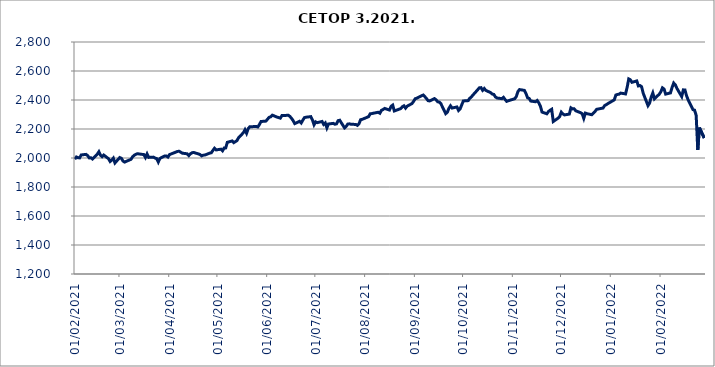
| Category | CETOP |
|---|---|
| 01/02/2021 | 1991.99 |
| 02/02/2021 | 2007.22 |
| 03/02/2021 | 2001.98 |
| 04/02/2021 | 2000.87 |
| 05/02/2021 | 2021.06 |
| 08/02/2021 | 2024.95 |
| 09/02/2021 | 2016.39 |
| 10/02/2021 | 2000.46 |
| 11/02/2021 | 2001.9 |
| 12/02/2021 | 1993.13 |
| 15/02/2021 | 2026.16 |
| 16/02/2021 | 2043.11 |
| 17/02/2021 | 2019.49 |
| 18/02/2021 | 2009.18 |
| 19/02/2021 | 2020.59 |
| 22/02/2021 | 1995 |
| 23/02/2021 | 1975.92 |
| 24/02/2021 | 1985.63 |
| 25/02/2021 | 1998.97 |
| 26/02/2021 | 1965.68 |
| 01/03/2021 | 2003.02 |
| 02/03/2021 | 1998.07 |
| 03/03/2021 | 1979.09 |
| 04/03/2021 | 1971.77 |
| 05/03/2021 | 1976.6 |
| 08/03/2021 | 1990.9 |
| 09/03/2021 | 2008.59 |
| 10/03/2021 | 2019.29 |
| 11/03/2021 | 2025.26 |
| 12/03/2021 | 2029.51 |
| 16/03/2021 | 2023.5 |
| 17/03/2021 | 2003.29 |
| 18/03/2021 | 2028.11 |
| 19/03/2021 | 2004.22 |
| 22/03/2021 | 2006.02 |
| 23/03/2021 | 1999.63 |
| 24/03/2021 | 1995.8 |
| 25/03/2021 | 1972.27 |
| 26/03/2021 | 1997.05 |
| 29/03/2021 | 2014.18 |
| 30/03/2021 | 2013.83 |
| 31/03/2021 | 2006.45 |
| 01/04/2021 | 2023.58 |
| 06/04/2021 | 2045.4 |
| 07/04/2021 | 2046.41 |
| 08/04/2021 | 2039.84 |
| 09/04/2021 | 2033.25 |
| 12/04/2021 | 2028.9 |
| 13/04/2021 | 2016.66 |
| 14/04/2021 | 2029.14 |
| 15/04/2021 | 2035.89 |
| 16/04/2021 | 2038.42 |
| 19/04/2021 | 2028.01 |
| 20/04/2021 | 2024 |
| 21/04/2021 | 2014.62 |
| 22/04/2021 | 2019.58 |
| 23/04/2021 | 2020.23 |
| 26/04/2021 | 2033.61 |
| 27/04/2021 | 2035.8 |
| 28/04/2021 | 2052.04 |
| 29/04/2021 | 2067.11 |
| 30/04/2021 | 2055.6 |
| 03/05/2021 | 2061.01 |
| 04/05/2021 | 2049.53 |
| 05/05/2021 | 2068.79 |
| 06/05/2021 | 2069.54 |
| 07/05/2021 | 2108.14 |
| 10/05/2021 | 2117.62 |
| 11/05/2021 | 2105.93 |
| 12/05/2021 | 2112.74 |
| 13/05/2021 | 2119.92 |
| 14/05/2021 | 2139.97 |
| 17/05/2021 | 2174.57 |
| 18/05/2021 | 2194.7 |
| 19/05/2021 | 2170.62 |
| 20/05/2021 | 2202.26 |
| 21/05/2021 | 2215.55 |
| 25/05/2021 | 2217.23 |
| 26/05/2021 | 2214.13 |
| 27/05/2021 | 2231.31 |
| 28/05/2021 | 2251.68 |
| 31/05/2021 | 2254.36 |
| 01/06/2021 | 2267.05 |
| 02/06/2021 | 2280.22 |
| 03/06/2021 | 2284.16 |
| 04/06/2021 | 2295.68 |
| 07/06/2021 | 2281.71 |
| 08/06/2021 | 2278.76 |
| 09/06/2021 | 2274.78 |
| 10/06/2021 | 2292.52 |
| 11/06/2021 | 2293.04 |
| 14/06/2021 | 2294.68 |
| 15/06/2021 | 2286.29 |
| 16/06/2021 | 2273.35 |
| 17/06/2021 | 2257.3 |
| 18/06/2021 | 2237.18 |
| 21/06/2021 | 2253.1 |
| 22/06/2021 | 2241.35 |
| 23/06/2021 | 2260.73 |
| 24/06/2021 | 2278.2 |
| 25/06/2021 | 2281.37 |
| 28/06/2021 | 2285.26 |
| 29/06/2021 | 2261.99 |
| 30/06/2021 | 2229.26 |
| 01/07/2021 | 2249.46 |
| 02/07/2021 | 2243.67 |
| 05/07/2021 | 2252.04 |
| 06/07/2021 | 2231.68 |
| 07/07/2021 | 2241.97 |
| 08/07/2021 | 2207.81 |
| 09/07/2021 | 2234.45 |
| 12/07/2021 | 2238.84 |
| 13/07/2021 | 2232.86 |
| 14/07/2021 | 2235.51 |
| 15/07/2021 | 2257.74 |
| 16/07/2021 | 2260.51 |
| 19/07/2021 | 2207.64 |
| 20/07/2021 | 2217.89 |
| 21/07/2021 | 2233.92 |
| 22/07/2021 | 2235.73 |
| 23/07/2021 | 2232.84 |
| 26/07/2021 | 2231.29 |
| 27/07/2021 | 2225.16 |
| 28/07/2021 | 2235.92 |
| 29/07/2021 | 2264.07 |
| 30/07/2021 | 2266.62 |
| 02/08/2021 | 2280.58 |
| 03/08/2021 | 2285.5 |
| 04/08/2021 | 2304.99 |
| 05/08/2021 | 2306.32 |
| 06/08/2021 | 2309.02 |
| 09/08/2021 | 2315.44 |
| 10/08/2021 | 2308.61 |
| 11/08/2021 | 2329.15 |
| 12/08/2021 | 2334.42 |
| 13/08/2021 | 2341.91 |
| 16/08/2021 | 2330.99 |
| 17/08/2021 | 2356.38 |
| 18/08/2021 | 2364.72 |
| 19/08/2021 | 2324.29 |
| 23/08/2021 | 2340.76 |
| 24/08/2021 | 2353.36 |
| 25/08/2021 | 2360.03 |
| 26/08/2021 | 2343.94 |
| 27/08/2021 | 2357.33 |
| 30/08/2021 | 2375.41 |
| 31/08/2021 | 2390.41 |
| 01/09/2021 | 2408.72 |
| 02/09/2021 | 2412.64 |
| 03/09/2021 | 2418.55 |
| 06/09/2021 | 2434.27 |
| 07/09/2021 | 2423.33 |
| 08/09/2021 | 2410.33 |
| 09/09/2021 | 2395.53 |
| 10/09/2021 | 2393.5 |
| 13/09/2021 | 2409.5 |
| 14/09/2021 | 2401.55 |
| 15/09/2021 | 2387.77 |
| 16/09/2021 | 2385.41 |
| 17/09/2021 | 2374.54 |
| 20/09/2021 | 2305.89 |
| 21/09/2021 | 2315.21 |
| 22/09/2021 | 2342.42 |
| 23/09/2021 | 2359.97 |
| 24/09/2021 | 2344.48 |
| 27/09/2021 | 2351.98 |
| 28/09/2021 | 2327.67 |
| 29/09/2021 | 2338.97 |
| 30/09/2021 | 2366.72 |
| 01/10/2021 | 2393.57 |
| 04/10/2021 | 2395.65 |
| 05/10/2021 | 2412.26 |
| 06/10/2021 | 2420.8 |
| 07/10/2021 | 2435.1 |
| 08/10/2021 | 2446.44 |
| 11/10/2021 | 2484.56 |
| 12/10/2021 | 2485.3 |
| 13/10/2021 | 2466.98 |
| 14/10/2021 | 2479.55 |
| 15/10/2021 | 2465.98 |
| 18/10/2021 | 2451.12 |
| 19/10/2021 | 2440.7 |
| 20/10/2021 | 2438.13 |
| 21/10/2021 | 2420.78 |
| 22/10/2021 | 2413.74 |
| 25/10/2021 | 2409.22 |
| 26/10/2021 | 2418.34 |
| 27/10/2021 | 2403.14 |
| 28/10/2021 | 2390.55 |
| 29/10/2021 | 2394.99 |
| 02/11/2021 | 2408.72 |
| 03/11/2021 | 2424.17 |
| 04/11/2021 | 2458.38 |
| 05/11/2021 | 2472.04 |
| 08/11/2021 | 2466.46 |
| 09/11/2021 | 2444.82 |
| 10/11/2021 | 2415.2 |
| 11/11/2021 | 2410.85 |
| 12/11/2021 | 2392.43 |
| 15/11/2021 | 2387.91 |
| 16/11/2021 | 2396.61 |
| 17/11/2021 | 2380.24 |
| 18/11/2021 | 2357.21 |
| 19/11/2021 | 2316.67 |
| 22/11/2021 | 2304.75 |
| 23/11/2021 | 2320.13 |
| 24/11/2021 | 2329.46 |
| 25/11/2021 | 2336.06 |
| 26/11/2021 | 2251.73 |
| 29/11/2021 | 2274.83 |
| 30/11/2021 | 2286.44 |
| 01/12/2021 | 2316.03 |
| 02/12/2021 | 2303.95 |
| 03/12/2021 | 2297.16 |
| 06/12/2021 | 2302.76 |
| 07/12/2021 | 2346 |
| 08/12/2021 | 2338.66 |
| 09/12/2021 | 2339.32 |
| 10/12/2021 | 2325.69 |
| 13/12/2021 | 2312.36 |
| 14/12/2021 | 2305.86 |
| 15/12/2021 | 2273.27 |
| 16/12/2021 | 2309.73 |
| 17/12/2021 | 2305.61 |
| 20/12/2021 | 2298.53 |
| 21/12/2021 | 2309.79 |
| 22/12/2021 | 2320.53 |
| 23/12/2021 | 2335.59 |
| 27/12/2021 | 2344.44 |
| 28/12/2021 | 2361.67 |
| 29/12/2021 | 2367.72 |
| 30/12/2021 | 2375.13 |
| 03/01/2022 | 2400.87 |
| 04/01/2022 | 2434.55 |
| 05/01/2022 | 2438.22 |
| 06/01/2022 | 2440.2 |
| 07/01/2022 | 2447.48 |
| 10/01/2022 | 2441.91 |
| 11/01/2022 | 2486.88 |
| 12/01/2022 | 2545.09 |
| 13/01/2022 | 2539.43 |
| 14/01/2022 | 2521.92 |
| 17/01/2022 | 2531.44 |
| 18/01/2022 | 2497.09 |
| 19/01/2022 | 2499.93 |
| 20/01/2022 | 2491.96 |
| 21/01/2022 | 2447.09 |
| 24/01/2022 | 2361.1 |
| 25/01/2022 | 2378.89 |
| 26/01/2022 | 2420.49 |
| 27/01/2022 | 2448.67 |
| 28/01/2022 | 2408.27 |
| 31/01/2022 | 2440.07 |
| 01/02/2022 | 2456.58 |
| 02/02/2022 | 2483.85 |
| 03/02/2022 | 2475.55 |
| 04/02/2022 | 2440.52 |
| 07/02/2022 | 2449.13 |
| 08/02/2022 | 2486.6 |
| 09/02/2022 | 2516.89 |
| 10/02/2022 | 2505.07 |
| 11/02/2022 | 2480.33 |
| 14/02/2022 | 2423.76 |
| 15/02/2022 | 2469.83 |
| 16/02/2022 | 2469.57 |
| 17/02/2022 | 2429.57 |
| 18/02/2022 | 2400.81 |
| 21/02/2022 | 2333.46 |
| 22/02/2022 | 2330.07 |
| 23/02/2022 | 2294.16 |
| 24/02/2022 | 2055.3 |
| 25/02/2022 | 2209.58 |
| 28/02/2022 | 2137.93 |